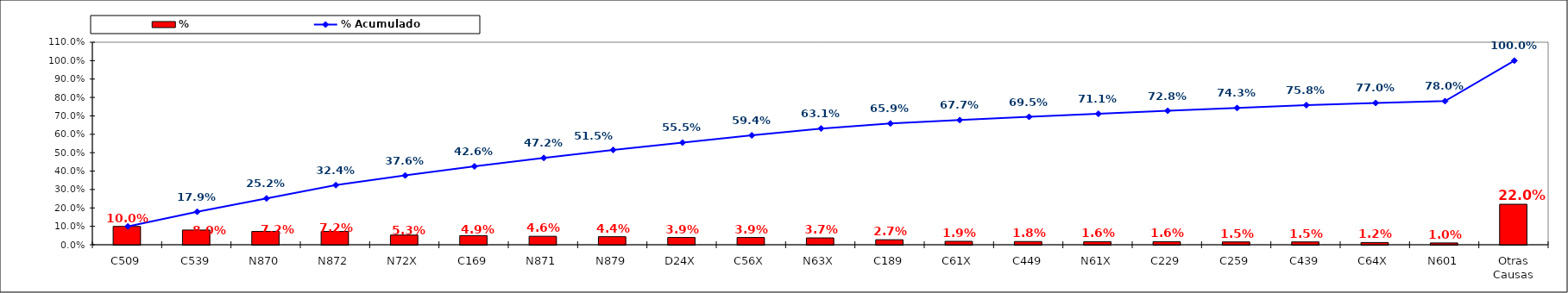
| Category | % |
|---|---|
| C509 | 0.1 |
| C539 | 0.08 |
| N870 | 0.072 |
| N872 | 0.072 |
| N72X | 0.053 |
| C169 | 0.049 |
| N871 | 0.046 |
| N879 | 0.044 |
| D24X | 0.039 |
| C56X | 0.039 |
| N63X | 0.037 |
| C189 | 0.027 |
| C61X | 0.019 |
| C449 | 0.018 |
| N61X | 0.016 |
| C229 | 0.016 |
| C259 | 0.015 |
| C439 | 0.015 |
| C64X | 0.012 |
| N601 | 0.01 |
| Otras Causas | 0.22 |